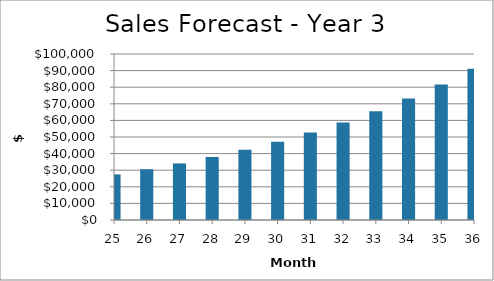
| Category | Year 3 |
|---|---|
| 25.0 | 27455.687 |
| 26.0 | 30584.952 |
| 27.0 | 34078.706 |
| 28.0 | 37980.417 |
| 29.0 | 42338.708 |
| 30.0 | 47207.981 |
| 31.0 | 52649.114 |
| 32.0 | 58730.246 |
| 33.0 | 65527.653 |
| 34.0 | 73126.736 |
| 35.0 | 81623.121 |
| 36.0 | 91123.9 |